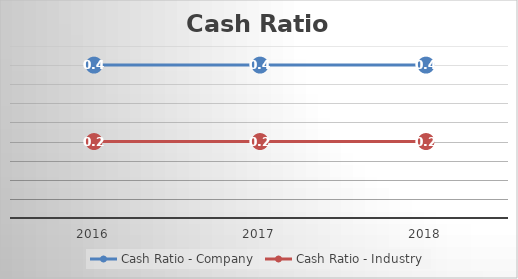
| Category | Cash Ratio - Company | Cash Ratio - Industry |
|---|---|---|
| 2016.0 | 0.4 | 0.2 |
| 2017.0 | 0.4 | 0.2 |
| 2018.0 | 0.4 | 0.2 |